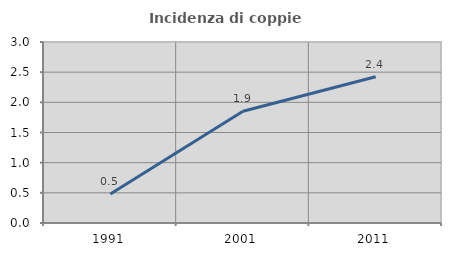
| Category | Incidenza di coppie miste |
|---|---|
| 1991.0 | 0.48 |
| 2001.0 | 1.852 |
| 2011.0 | 2.423 |